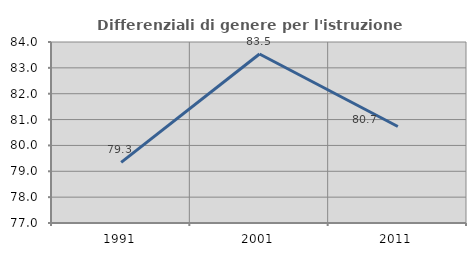
| Category | Differenziali di genere per l'istruzione superiore |
|---|---|
| 1991.0 | 79.347 |
| 2001.0 | 83.536 |
| 2011.0 | 80.731 |